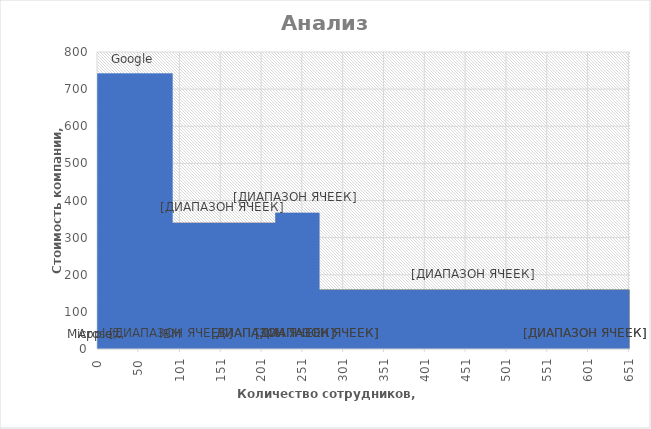
| Category | Пустышка |
|---|---|
| 0.0 | 0 |
| 0.0 | 0 |
| 46.0 | 742 |
| 92.0 | 0 |
| 92.0 | 0 |
| 155.0 | 340 |
| 218.0 | 0 |
| 218.0 | 0 |
| 245.0 | 367 |
| 272.0 | 0 |
| 272.0 | 0 |
| 462.0 | 160 |
| 652.0 | 0 |
| 652.0 | 0 |